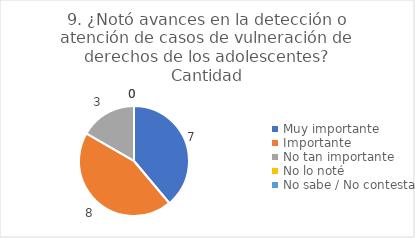
| Category | 9. ¿Notó avances en la detección o atención de casos de vulneración de derechos de los adolescentes? |
|---|---|
| Muy importante  | 0.389 |
| Importante  | 0.444 |
| No tan importante  | 0.167 |
| No lo noté  | 0 |
| No sabe / No contesta | 0 |